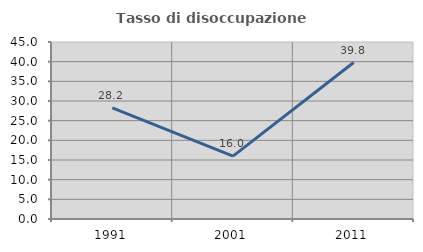
| Category | Tasso di disoccupazione giovanile  |
|---|---|
| 1991.0 | 28.235 |
| 2001.0 | 16 |
| 2011.0 | 39.773 |